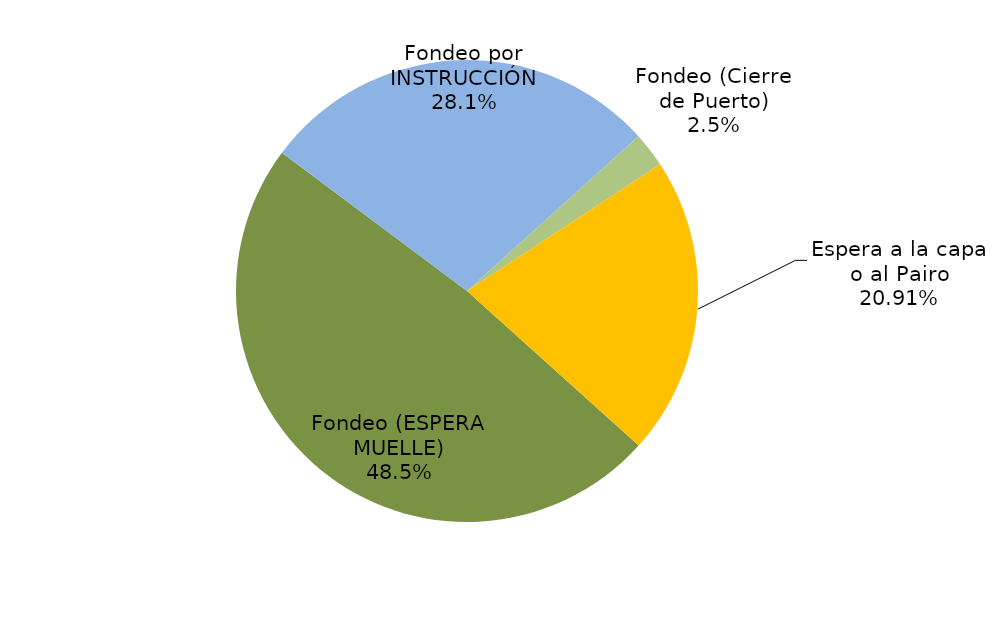
| Category | Series 0 |
|---|---|
| Fondeo (ESPERA MUELLE) | 27439.317 |
| Fondeo por INSTRUCCIÓN | 15885.317 |
| Fondeo (Cierre de Puerto) | 1385.217 |
| Espera a la capa o al Pairo | 11818.833 |